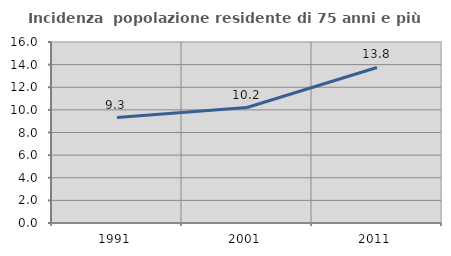
| Category | Incidenza  popolazione residente di 75 anni e più |
|---|---|
| 1991.0 | 9.324 |
| 2001.0 | 10.206 |
| 2011.0 | 13.75 |